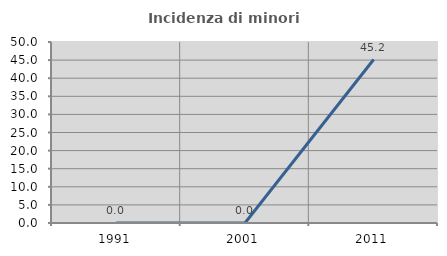
| Category | Incidenza di minori stranieri |
|---|---|
| 1991.0 | 0 |
| 2001.0 | 0 |
| 2011.0 | 45.161 |